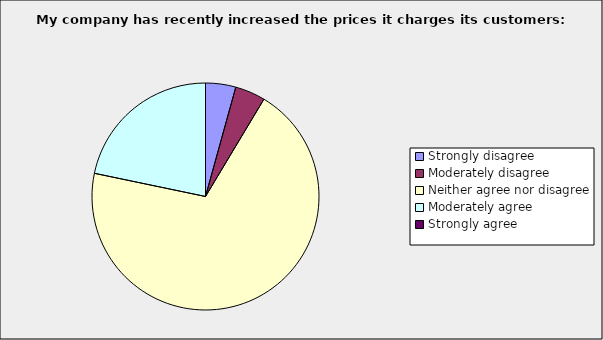
| Category | Series 0 |
|---|---|
| Strongly disagree | 0.043 |
| Moderately disagree | 0.043 |
| Neither agree nor disagree | 0.696 |
| Moderately agree | 0.217 |
| Strongly agree | 0 |